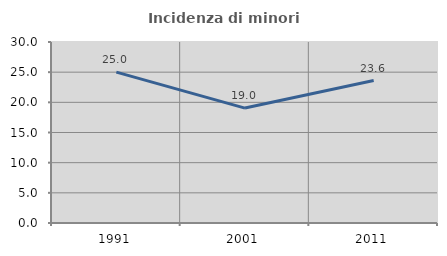
| Category | Incidenza di minori stranieri |
|---|---|
| 1991.0 | 25 |
| 2001.0 | 19.048 |
| 2011.0 | 23.618 |